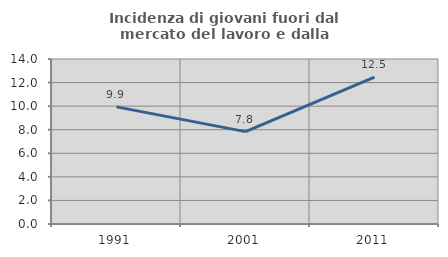
| Category | Incidenza di giovani fuori dal mercato del lavoro e dalla formazione  |
|---|---|
| 1991.0 | 9.936 |
| 2001.0 | 7.839 |
| 2011.0 | 12.453 |